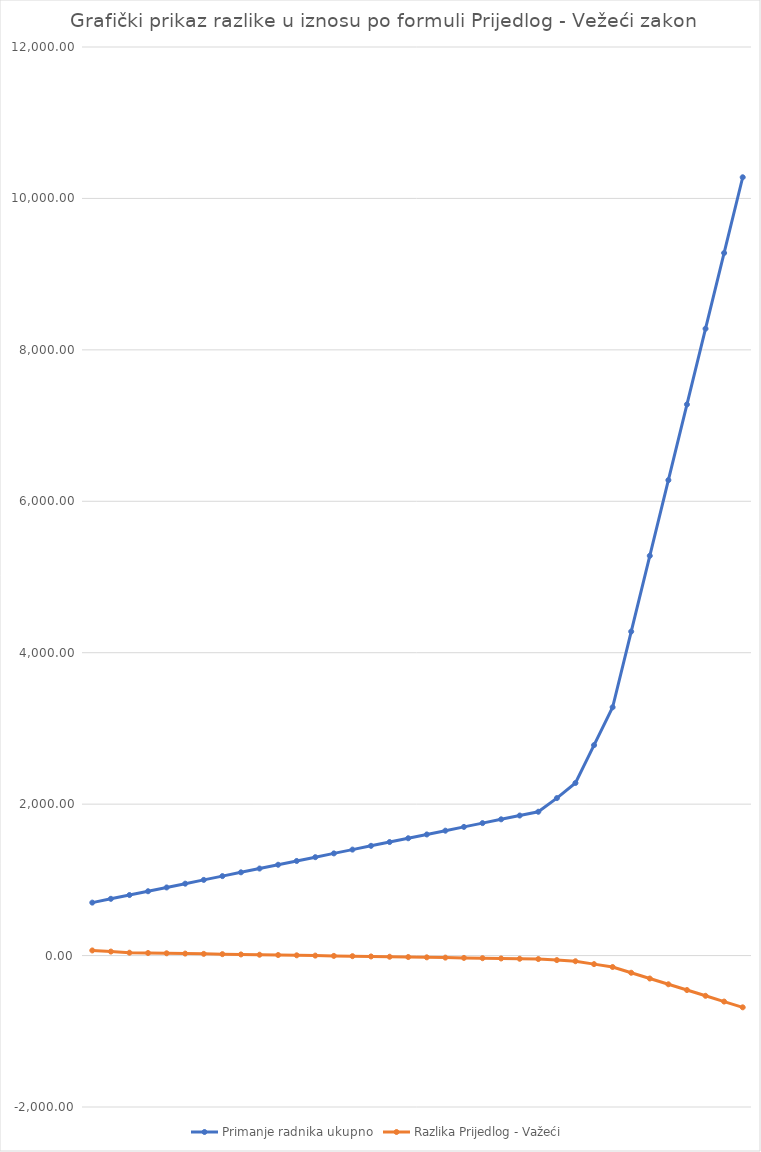
| Category | Primanje radnika ukupno | Razlika Prijedlog - Važeći |
|---|---|---|
| 0 | 699.5 | 67.69 |
| 1 | 749.5 | 52.75 |
| 2 | 799.5 | 37.8 |
| 3 | 849.5 | 33.91 |
| 4 | 899.5 | 30.09 |
| 5 | 949.5 | 26.31 |
| 6 | 999.5 | 22.48 |
| 7 | 1049.5 | 18.7 |
| 8 | 1099.5 | 14.89 |
| 9 | 1149.5 | 11.09 |
| 10 | 1199.5 | 7.27 |
| 11 | 1249.5 | 3.46 |
| 12 | 1299.5 | -0.32 |
| 13 | 1349.5 | -4.14 |
| 14 | 1399.5 | -7.93 |
| 15 | 1449.5 | -11.74 |
| 16 | 1499.5 | -15.54 |
| 17 | 1549.5 | -19.34 |
| 18 | 1599.5 | -23.15 |
| 19 | 1649.5 | -26.95 |
| 20 | 1699.5 | -30.77 |
| 21 | 1749.5 | -34.56 |
| 22 | 1799.5 | -38.36 |
| 23 | 1849.5 | -42.17 |
| 24 | 1899.5 | -45.97 |
| 25 | 2079.5 | -59.67 |
| 26 | 2279.5 | -74.87 |
| 27 | 2779.5 | -112.93 |
| 28 | 3279.5 | -150.95 |
| 29 | 4279.5 | -227.03 |
| 30 | 5279.5 | -303.11 |
| 31 | 6279.5 | -379.18 |
| 32 | 7279.5 | -455.26 |
| 33 | 8279.5 | -531.33 |
| 34 | 9279.5 | -607.41 |
| 35 | 10279.5 | -683.47 |